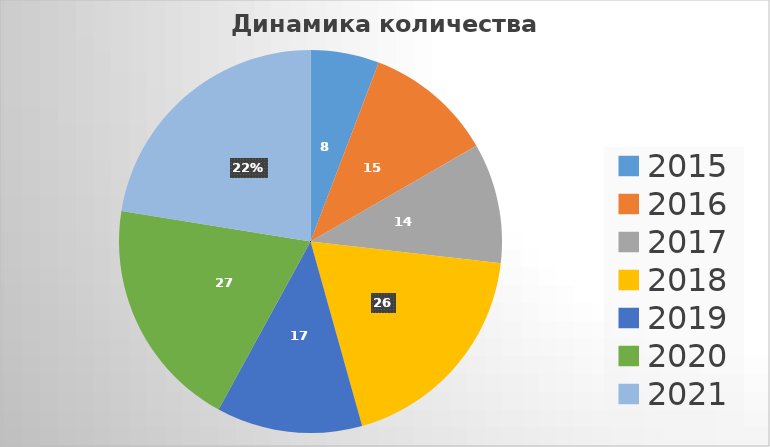
| Category | Series 0 |
|---|---|
| 2015.0 | 8 |
| 2016.0 | 15 |
| 2017.0 | 14 |
| 2018.0 | 26 |
| 2019.0 | 17 |
| 2020.0 | 27 |
| 2021.0 | 31 |